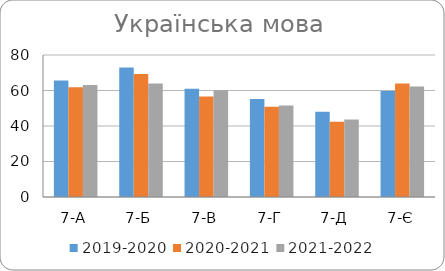
| Category | 2019-2020 | 2020-2021 | 2021-2022 |
|---|---|---|---|
| 7-А | 65.6 | 61.9 | 63.1 |
| 7-Б | 72.9 | 69.3 | 64 |
| 7-В | 61 | 56.6 | 60.1 |
| 7-Г | 55.2 | 50.8 | 51.5 |
| 7-Д | 48 | 42.4 | 43.6 |
| 7-Є | 59.7 | 64 | 62.2 |